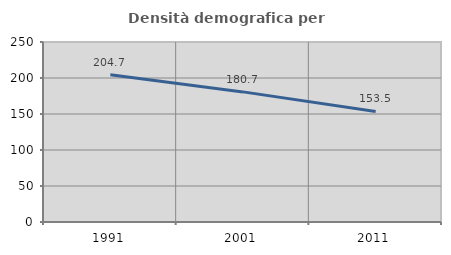
| Category | Densità demografica |
|---|---|
| 1991.0 | 204.656 |
| 2001.0 | 180.71 |
| 2011.0 | 153.473 |